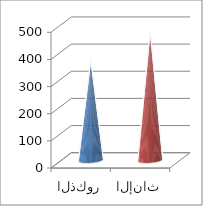
| Category | Series 0 |
|---|---|
| الذكور | 371 |
| الإناث | 477 |